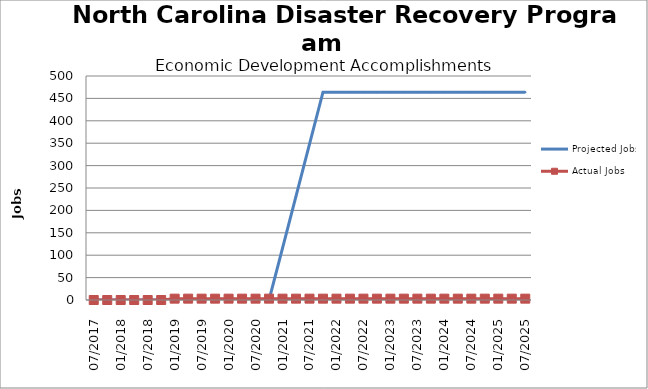
| Category | Projected Jobs | Actual Jobs |
|---|---|---|
| 07/2017 | 0 | 0 |
| 10/2017 | 0 | 0 |
| 01/2018 | 0 | 0 |
| 4/2018 | 0 | 0 |
| 07/2018 | 0 | 0 |
| 10/2018 | 0 | 0 |
| 01/2019 | 0 | 3 |
| 4/2019 | 0 | 3 |
| 07/2019 | 0 | 3 |
| 10/2019 | 0 | 3 |
| 01/2020 | 0 | 3 |
| 4/2020 | 0 | 3 |
| 07/2020 | 0 | 3 |
| 10/2020 | 0 | 3 |
| 01/2021 | 116 | 3 |
| 4/2021 | 232 | 3 |
| 07/2021 | 348 | 3 |
| 10/2021 | 464 | 3 |
| 01/2022 | 464 | 3 |
| 4/2022 | 464 | 3 |
| 07/2022 | 464 | 3 |
| 10/2022 | 464 | 3 |
| 01/2023 | 464 | 3 |
| 4/2023 | 464 | 3 |
| 07/2023 | 464 | 3 |
| 10/2023 | 464 | 3 |
| 01/2024 | 464 | 3 |
| 4/2024 | 464 | 3 |
| 07/2024 | 464 | 3 |
| 10/2024 | 464 | 3 |
| 01/2025 | 464 | 3 |
| 4/2025 | 464 | 3 |
| 07/2025 | 464 | 3 |